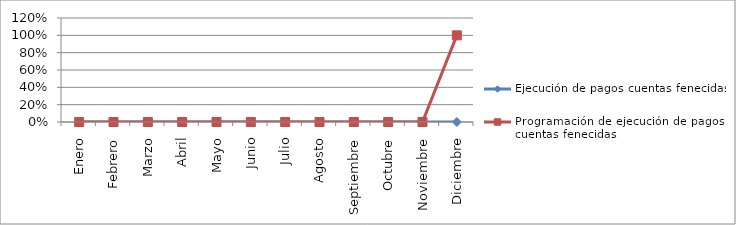
| Category | Ejecución de pagos cuentas fenecidas | Programación de ejecución de pagos de cuentas fenecidas |
|---|---|---|
| 0 | 0 | 0 |
| 1 | 0 | 0 |
| 2 | 0 | 0 |
| 3 | 0 | 0 |
| 4 | 0 | 0 |
| 5 | 0 | 0 |
| 6 | 0 | 0 |
| 7 | 0 | 0 |
| 8 | 0 | 0 |
| 9 | 0 | 0 |
| 10 | 0 | 0 |
| 11 | 0 | 1 |